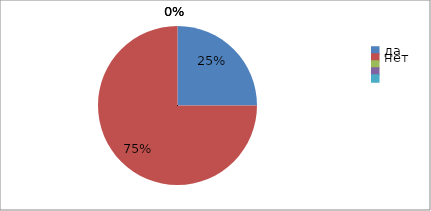
| Category | Series 0 | Series 1 |
|---|---|---|
| да | 25 | 25 |
| нет | 75 | 75 |